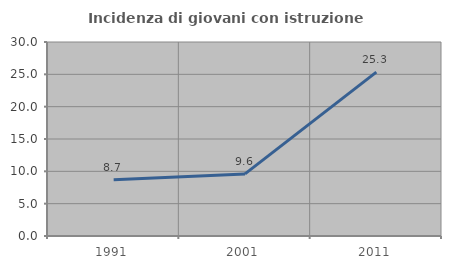
| Category | Incidenza di giovani con istruzione universitaria |
|---|---|
| 1991.0 | 8.696 |
| 2001.0 | 9.6 |
| 2011.0 | 25.342 |